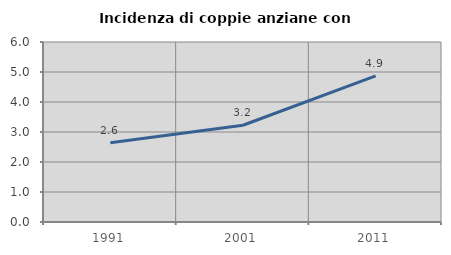
| Category | Incidenza di coppie anziane con figli |
|---|---|
| 1991.0 | 2.643 |
| 2001.0 | 3.226 |
| 2011.0 | 4.874 |